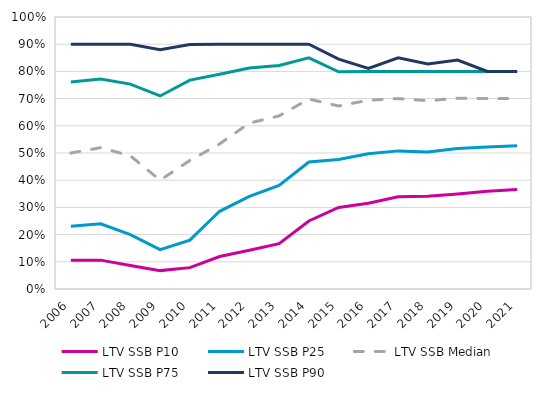
| Category | LTV SSB P10 | LTV SSB P25 | LTV SSB Median | LTV SSB P75 | LTV SSB P90  |
|---|---|---|---|---|---|
| 2006.0 | 0.105 | 0.231 | 0.5 | 0.761 | 0.9 |
| 2007.0 | 0.106 | 0.24 | 0.52 | 0.772 | 0.9 |
| 2008.0 | 0.087 | 0.2 | 0.49 | 0.753 | 0.9 |
| 2009.0 | 0.068 | 0.145 | 0.4 | 0.71 | 0.88 |
| 2010.0 | 0.078 | 0.18 | 0.473 | 0.768 | 0.899 |
| 2011.0 | 0.119 | 0.286 | 0.533 | 0.789 | 0.9 |
| 2012.0 | 0.143 | 0.34 | 0.61 | 0.812 | 0.9 |
| 2013.0 | 0.167 | 0.381 | 0.636 | 0.822 | 0.9 |
| 2014.0 | 0.25 | 0.467 | 0.698 | 0.85 | 0.9 |
| 2015.0 | 0.3 | 0.476 | 0.673 | 0.798 | 0.845 |
| 2016.0 | 0.316 | 0.497 | 0.694 | 0.8 | 0.811 |
| 2017.0 | 0.339 | 0.508 | 0.7 | 0.8 | 0.85 |
| 2018.0 | 0.341 | 0.504 | 0.692 | 0.8 | 0.827 |
| 2019.0 | 0.35 | 0.517 | 0.701 | 0.8 | 0.842 |
| 2020.0 | 0.359 | 0.522 | 0.7 | 0.8 | 0.8 |
| 2021.0 | 0.366 | 0.526 | 0.7 | 0.8 | 0.8 |